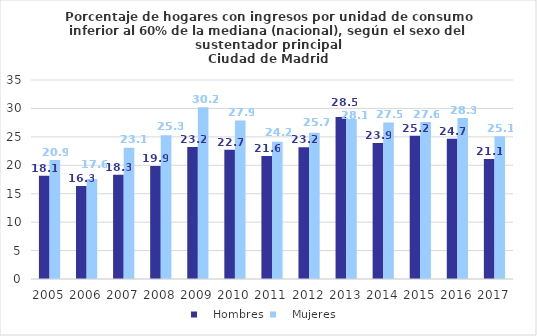
| Category |    Hombres |    Mujeres |
|---|---|---|
| 2005.0 | 18.14 | 20.913 |
| 2006.0 | 16.338 | 17.587 |
| 2007.0 | 18.324 | 23.093 |
| 2008.0 | 19.861 | 25.264 |
| 2009.0 | 23.199 | 30.186 |
| 2010.0 | 22.741 | 27.898 |
| 2011.0 | 21.647 | 24.157 |
| 2012.0 | 23.173 | 25.728 |
| 2013.0 | 28.487 | 28.138 |
| 2014.0 | 23.906 | 27.546 |
| 2015.0 | 25.2 | 27.6 |
| 2016.0 | 24.656 | 28.316 |
| 2017.0 | 21.1 | 25.1 |